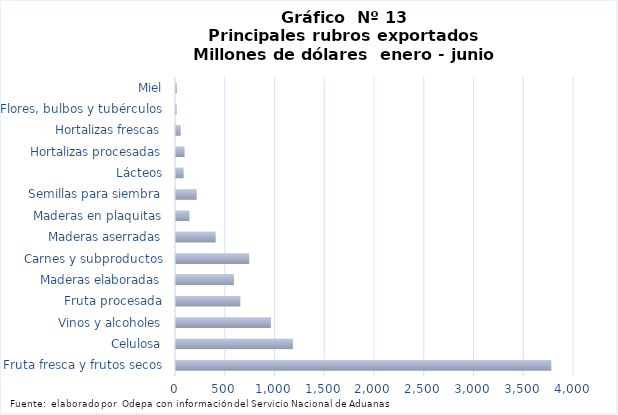
| Category | Series 7 |
|---|---|
| Fruta fresca y frutos secos | 3772257.154 |
| Celulosa | 1175171.812 |
| Vinos y alcoholes | 953474.359 |
| Fruta procesada | 646535.328 |
| Maderas elaboradas | 581945.654 |
| Carnes y subproductos | 736057.678 |
| Maderas aserradas | 398927.93 |
| Maderas en plaquitas | 135449.395 |
| Semillas para siembra | 207786.495 |
| Lácteos | 77184.733 |
| Hortalizas procesadas | 86230.748 |
| Hortalizas frescas | 47207.879 |
| Flores, bulbos y tubérculos | 6009.021 |
| Miel | 7928.208 |